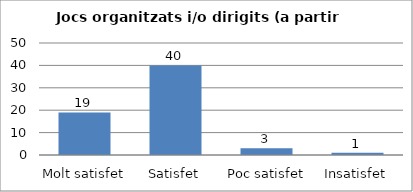
| Category | Series 0 |
|---|---|
| Molt satisfet | 19 |
| Satisfet | 40 |
| Poc satisfet | 3 |
| Insatisfet | 1 |